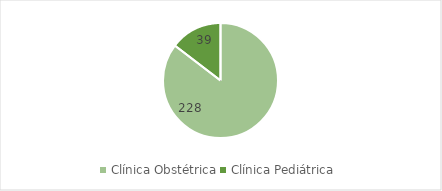
| Category | Series 0 |
|---|---|
| Clínica Obstétrica | 228 |
| Clínica Pediátrica  | 39 |